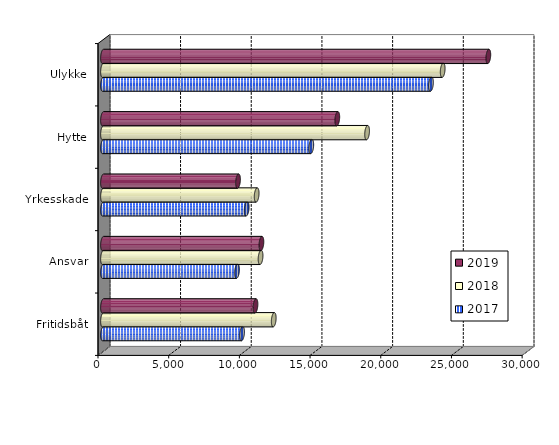
| Category | 2017 | 2018 | 2019 |
|---|---|---|---|
| Fritidsbåt | 9835.302 | 12077.195 | 10785.192 |
| Ansvar | 9480.052 | 11145.096 | 11204.776 |
| Yrkesskade | 10163.027 | 10868.336 | 9550.428 |
| Hytte | 14731.573 | 18679.168 | 16571.543 |
| Ulykke | 23196.56 | 24026.283 | 27254.8 |